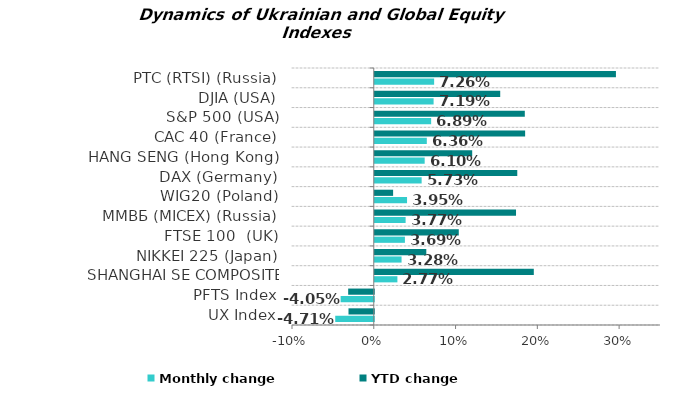
| Category | Monthly change | YTD change |
|---|---|---|
| UX Index | -0.047 | -0.031 |
| PFTS Index | -0.041 | -0.031 |
| SHANGHAI SE COMPOSITE (China) | 0.028 | 0.194 |
| NIKKEI 225 (Japan) | 0.033 | 0.063 |
| FTSE 100  (UK) | 0.037 | 0.103 |
| ММВБ (MICEX) (Russia) | 0.038 | 0.173 |
| WIG20 (Poland) | 0.039 | 0.022 |
| DAX (Germany) | 0.057 | 0.174 |
| HANG SENG (Hong Kong) | 0.061 | 0.119 |
| CAC 40 (France) | 0.064 | 0.184 |
| S&P 500 (USA) | 0.069 | 0.183 |
| DJIA (USA) | 0.072 | 0.153 |
| РТС (RTSI) (Russia) | 0.073 | 0.295 |